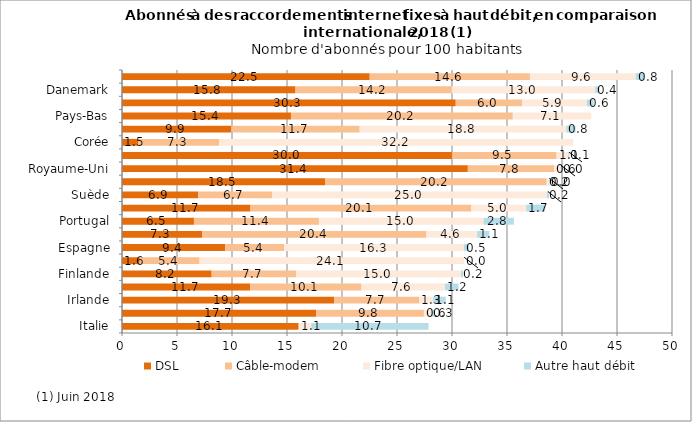
| Category | DSL  | Câble-modem | Fibre optique/LAN | Autre haut débit  |
|---|---|---|---|---|
| Italie | 16.06 | 0 | 1.149 | 10.659 |
| Autriche | 17.65 | 9.796 | 0.642 | 0.329 |
| Irlande | 19.29 | 7.734 | 1.265 | 1.137 |
| OCDE | 11.66 | 10.113 | 7.584 | 1.237 |
| Finlande | 8.15 | 7.698 | 14.978 | 0.181 |
| Japon | 1.61 | 5.444 | 24.051 | 0.004 |
| Espagne | 9.37 | 5.391 | 16.327 | 0.465 |
| Etats-Unis | 7.28 | 20.398 | 4.605 | 1.107 |
| Portugal | 6.54 | 11.365 | 14.962 | 2.764 |
| Canada | 11.68 | 20.08 | 4.997 | 1.716 |
| Suède | 6.94 | 6.73 | 24.959 | 0.174 |
| Belgique | 18.46 | 20.15 | 0.218 | 0.046 |
| Royaume-Uni | 31.44 | 7.833 | 0.607 | 0.027 |
| Allemagne | 30.02 | 9.492 | 1.07 | 0.101 |
| Corée | 1.49 | 7.345 | 32.19 | 0 |
| Norvège | 9.94 | 11.667 | 18.784 | 0.836 |
| Pays-Bas | 15.36 | 20.168 | 7.127 | 0 |
| France | 30.34 | 6.035 | 5.885 | 0.613 |
| Danemark | 15.77 | 14.216 | 13.037 | 0.369 |
| Suisse | 22.52 | 14.565 | 9.619 | 0.817 |